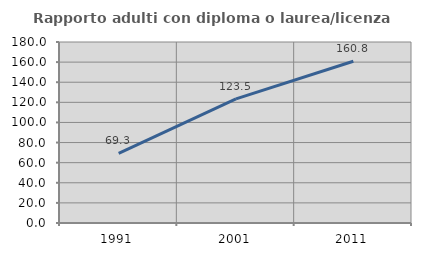
| Category | Rapporto adulti con diploma o laurea/licenza media  |
|---|---|
| 1991.0 | 69.274 |
| 2001.0 | 123.469 |
| 2011.0 | 160.849 |